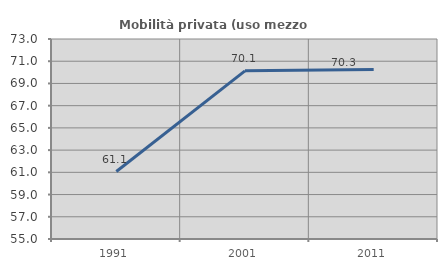
| Category | Mobilità privata (uso mezzo privato) |
|---|---|
| 1991.0 | 61.07 |
| 2001.0 | 70.133 |
| 2011.0 | 70.254 |